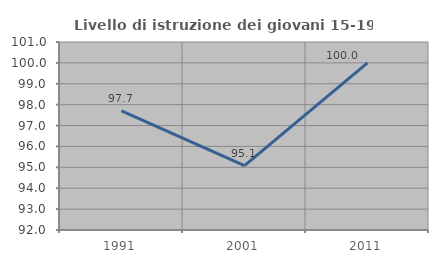
| Category | Livello di istruzione dei giovani 15-19 anni |
|---|---|
| 1991.0 | 97.701 |
| 2001.0 | 95.082 |
| 2011.0 | 100 |